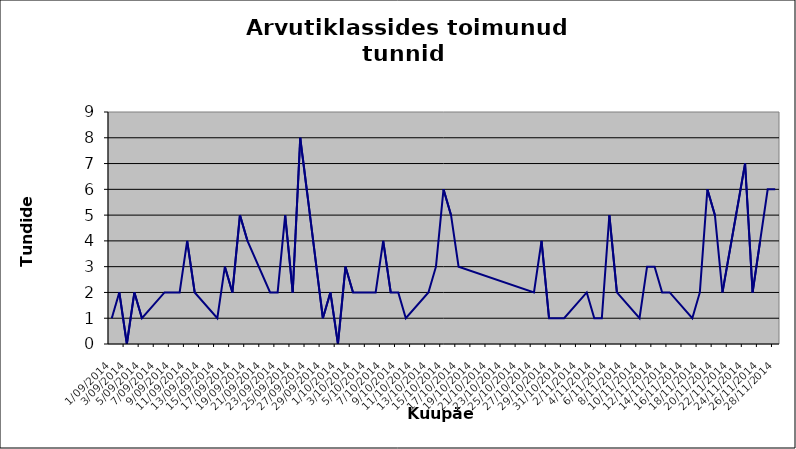
| Category | Series 0 |
|---|---|
| 2014-09-01 | 1 |
| 2014-09-02 | 2 |
| 2014-09-03 | 0 |
| 2014-09-04 | 2 |
| 2014-09-05 | 1 |
| 2014-09-08 | 2 |
| 2014-09-09 | 2 |
| 2014-09-10 | 2 |
| 2014-09-11 | 4 |
| 2014-09-12 | 2 |
| 2014-09-15 | 1 |
| 2014-09-16 | 3 |
| 2014-09-17 | 2 |
| 2014-09-18 | 5 |
| 2014-09-19 | 4 |
| 2014-09-22 | 2 |
| 2014-09-23 | 2 |
| 2014-09-24 | 5 |
| 2014-09-25 | 2 |
| 2014-09-26 | 8 |
| 2014-09-29 | 1 |
| 2014-09-30 | 2 |
| 2014-10-01 | 0 |
| 2014-10-02 | 3 |
| 2014-10-03 | 2 |
| 2014-10-06 | 2 |
| 2014-10-07 | 4 |
| 2014-10-08 | 2 |
| 2014-10-09 | 2 |
| 2014-10-10 | 1 |
| 2014-10-13 | 2 |
| 2014-10-14 | 3 |
| 2014-10-15 | 6 |
| 2014-10-16 | 5 |
| 2014-10-17 | 3 |
| 2014-10-27 | 2 |
| 2014-10-28 | 4 |
| 2014-10-29 | 1 |
| 2014-10-30 | 1 |
| 2014-10-31 | 1 |
| 2014-11-03 | 2 |
| 2014-11-04 | 1 |
| 2014-11-05 | 1 |
| 2014-11-06 | 5 |
| 2014-11-07 | 2 |
| 2014-11-10 | 1 |
| 2014-11-11 | 3 |
| 2014-11-12 | 3 |
| 2014-11-13 | 2 |
| 2014-11-14 | 2 |
| 2014-11-17 | 1 |
| 2014-11-18 | 2 |
| 2014-11-19 | 6 |
| 2014-11-20 | 5 |
| 2014-11-21 | 2 |
| 2014-11-24 | 7 |
| 2014-11-25 | 2 |
| 2014-11-26 | 4 |
| 2014-11-27 | 6 |
| 2014-11-28 | 6 |